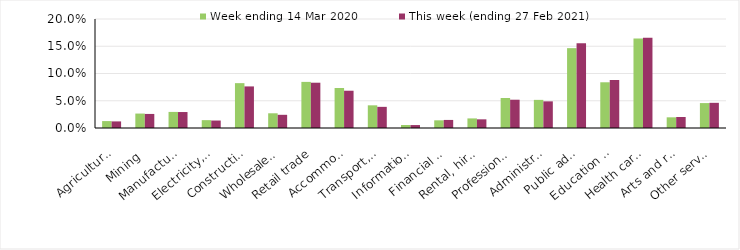
| Category | Week ending 14 Mar 2020 | This week (ending 27 Feb 2021) |
|---|---|---|
| Agriculture, forestry and fishing | 0.013 | 0.012 |
| Mining | 0.026 | 0.026 |
| Manufacturing | 0.03 | 0.029 |
| Electricity, gas, water and waste services | 0.014 | 0.014 |
| Construction | 0.082 | 0.076 |
| Wholesale trade | 0.027 | 0.024 |
| Retail trade | 0.085 | 0.083 |
| Accommodation and food services | 0.073 | 0.068 |
| Transport, postal and warehousing | 0.042 | 0.039 |
| Information media and telecommunications | 0.006 | 0.005 |
| Financial and insurance services | 0.014 | 0.015 |
| Rental, hiring and real estate services | 0.018 | 0.016 |
| Professional, scientific and technical services | 0.055 | 0.052 |
| Administrative and support services | 0.052 | 0.049 |
| Public administration and safety | 0.146 | 0.156 |
| Education and training | 0.084 | 0.088 |
| Health care and social assistance | 0.164 | 0.166 |
| Arts and recreation services | 0.02 | 0.02 |
| Other services | 0.046 | 0.046 |